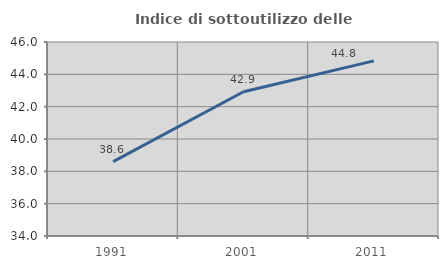
| Category | Indice di sottoutilizzo delle abitazioni  |
|---|---|
| 1991.0 | 38.603 |
| 2001.0 | 42.925 |
| 2011.0 | 44.831 |